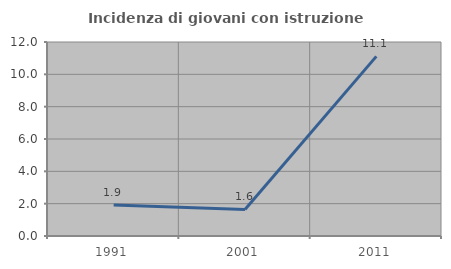
| Category | Incidenza di giovani con istruzione universitaria |
|---|---|
| 1991.0 | 1.923 |
| 2001.0 | 1.639 |
| 2011.0 | 11.111 |